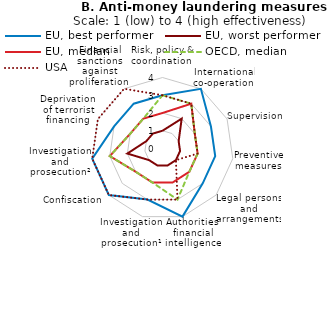
| Category | EU, best performer | EU, worst performer | EU, median | OECD, median | USA |
|---|---|---|---|---|---|
| Risk, policy & coordination  | 3 | 1 | 2 | 3 | 3 |
| International co-operation  | 4 | 2 | 3 | 3 | 3 |
| Supervision  | 3 | 1 | 2 | 2 | 2 |
| Preventive measures  | 3 | 1 | 2 | 2 | 2 |
| Legal persons and arrangements  | 3 | 1 | 2 | 2 | 1 |
| Authorities' financial intelligence | 4 | 1 | 2 | 3 | 3 |
| Investigation and prosecution¹ | 3 | 1 | 2 | 2 | 3 |
| Confiscation  | 4 | 1 | 2 | 2 | 4 |
| Investigation and prosecution² | 4 | 2 | 3 | 3 | 4 |
| Deprivation of terrorist financing | 3 | 1 | 2 | 2 | 4 |
| Financial sanctions against proliferation  | 3 | 1 | 2 | 2 | 4 |